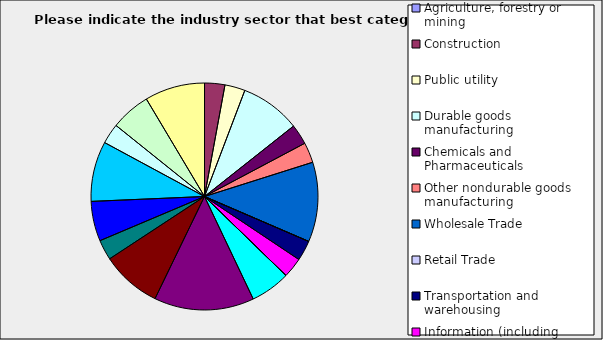
| Category | Series 0 |
|---|---|
| Agriculture, forestry or mining | 0 |
| Construction | 0.029 |
| Public utility | 0.029 |
| Durable goods manufacturing | 0.086 |
| Chemicals and Pharmaceuticals | 0.029 |
| Other nondurable goods manufacturing | 0.029 |
| Wholesale Trade | 0.114 |
| Retail Trade | 0 |
| Transportation and warehousing | 0.029 |
| Information (including broadcasting and telecommunication) | 0.029 |
| Finance and Insurance | 0 |
| Real Estate | 0.057 |
| Professional, scientific and technical services | 0.143 |
| Consulting | 0.086 |
| Administrative and office services (including waste management) | 0.029 |
| Education | 0.057 |
| Health Care and social services | 0.086 |
| Arts, entertainment and recreation | 0.029 |
| Accommodation and food services | 0.057 |
| Other | 0.086 |